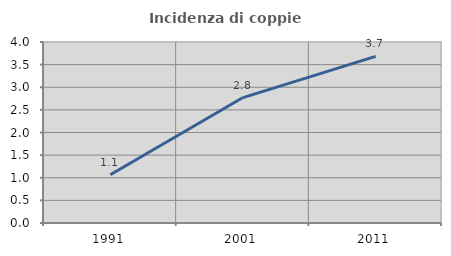
| Category | Incidenza di coppie miste |
|---|---|
| 1991.0 | 1.065 |
| 2001.0 | 2.772 |
| 2011.0 | 3.683 |